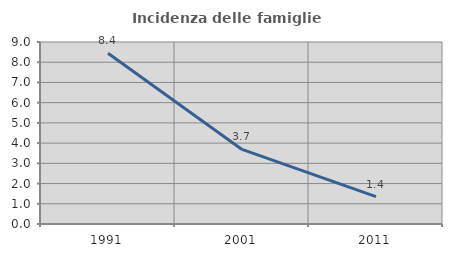
| Category | Incidenza delle famiglie numerose |
|---|---|
| 1991.0 | 8.448 |
| 2001.0 | 3.689 |
| 2011.0 | 1.35 |